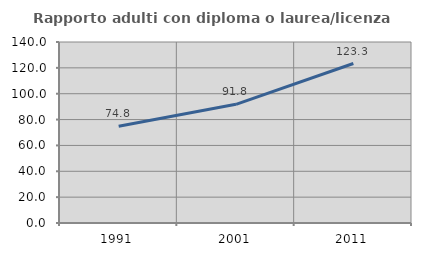
| Category | Rapporto adulti con diploma o laurea/licenza media  |
|---|---|
| 1991.0 | 74.813 |
| 2001.0 | 91.793 |
| 2011.0 | 123.34 |